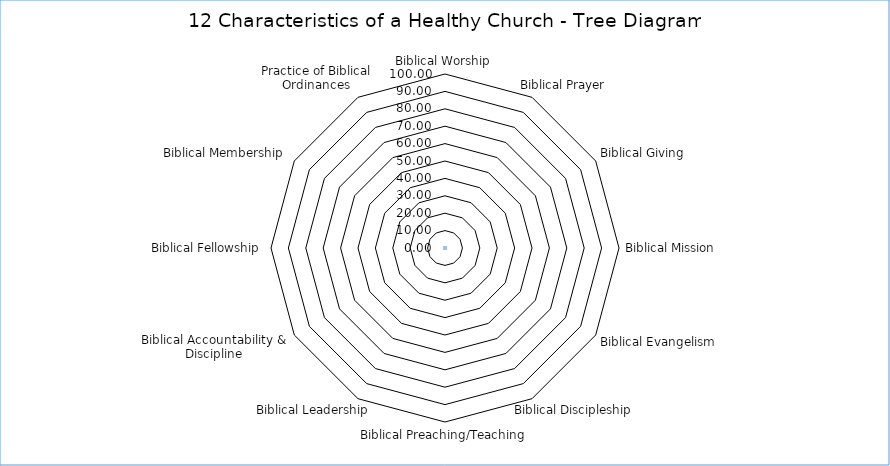
| Category | Series 0 |
|---|---|
| Biblical Worship | 0 |
| Biblical Prayer | 0 |
| Biblical Giving | 0 |
| Biblical Mission | 0 |
| Biblical Evangelism | 0 |
| Biblical Discipleship | 0 |
| Biblical Preaching/Teaching | 0 |
| Biblical Leadership | 0 |
| Biblical Accountability & Discipline | 0 |
| Biblical Fellowship | 0 |
| Biblical Membership | 0 |
| Practice of Biblical Ordinances | 0 |